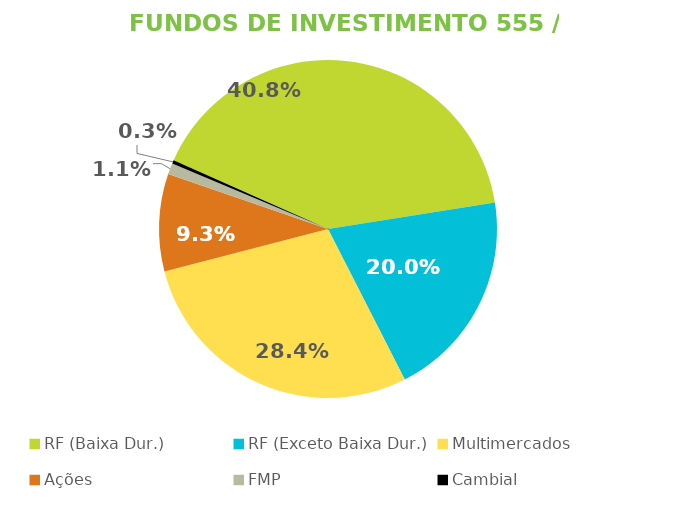
| Category | Fundos de Investimento 555 / FMP |
|---|---|
| RF (Baixa Dur.) | 0.408 |
| RF (Exceto Baixa Dur.) | 0.2 |
| Multimercados | 0.284 |
| Ações | 0.093 |
| FMP | 0.011 |
| Cambial | 0.003 |